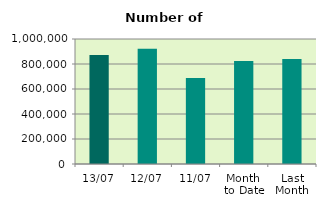
| Category | Series 0 |
|---|---|
| 13/07 | 871302 |
| 12/07 | 922126 |
| 11/07 | 687190 |
| Month 
to Date | 823676.444 |
| Last
Month | 840506.364 |